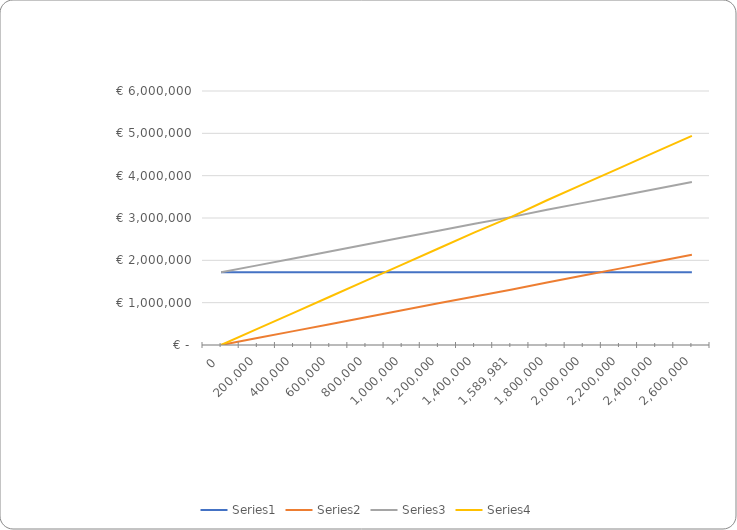
| Category | Series 0 | Series 1 | Series 2 | Series 3 |
|---|---|---|---|---|
| 0.0 | 1717000 | 0 | 1717000 | 0 |
| 200000.0 | 1717000 | 164000 | 1881000 | 380000 |
| 400000.0 | 1717000 | 328000 | 2045000 | 760000 |
| 600000.0 | 1717000 | 492 | 2209000 | 1140000 |
| 800000.0 | 1717000 | 656000 | 2373000 | 1520000 |
| 1000000.0 | 1717000 | 820000 | 2537000 | 1900000 |
| 1200000.0 | 1717000 | 984000 | 2701000 | 2280000 |
| 1400000.0 | 1717000 | 1148000 | 2865000 | 2660000 |
| 1589981.0 | 1717000 | 1303784.42 | 3020784.42 | 3020963.9 |
| 1800000.0 | 1717000 | 1476000 | 3193000 | 3420000 |
| 2000000.0 | 1717000 | 1640000 | 3357000 | 3800000 |
| 2200000.0 | 1717000 | 1804000 | 3521000 | 4180000 |
| 2400000.0 | 1717000 | 1968000 | 3685000 | 4560000 |
| 2600000.0 | 1717000 | 2132000 | 3849000 | 4940000 |